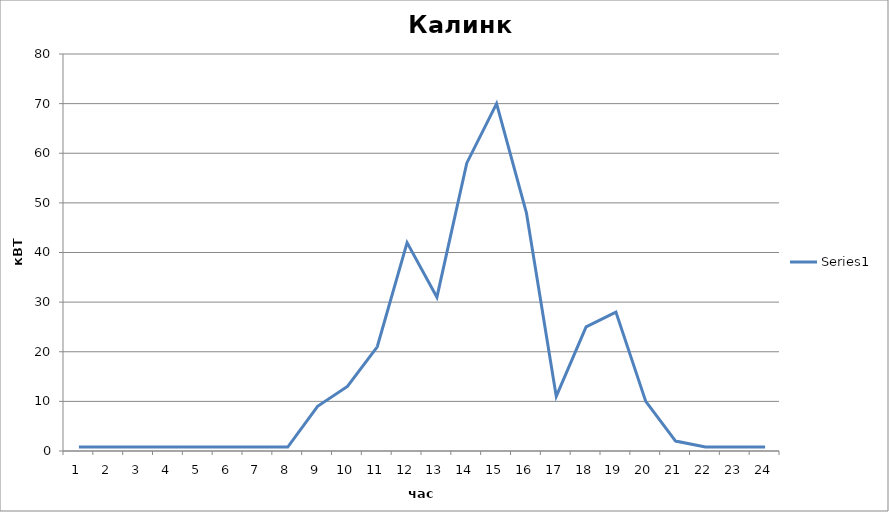
| Category | Series 0 |
|---|---|
| 0 | 0.8 |
| 1 | 0.8 |
| 2 | 0.8 |
| 3 | 0.8 |
| 4 | 0.8 |
| 5 | 0.8 |
| 6 | 0.8 |
| 7 | 0.8 |
| 8 | 9 |
| 9 | 13 |
| 10 | 21 |
| 11 | 42 |
| 12 | 31 |
| 13 | 58 |
| 14 | 70 |
| 15 | 48 |
| 16 | 11 |
| 17 | 25 |
| 18 | 28 |
| 19 | 10 |
| 20 | 2 |
| 21 | 0.8 |
| 22 | 0.8 |
| 23 | 0.8 |